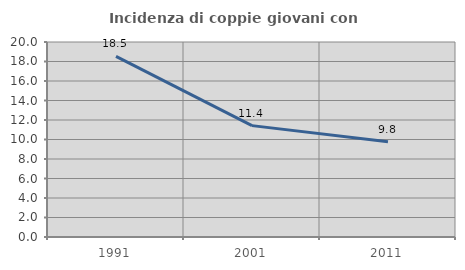
| Category | Incidenza di coppie giovani con figli |
|---|---|
| 1991.0 | 18.519 |
| 2001.0 | 11.422 |
| 2011.0 | 9.78 |